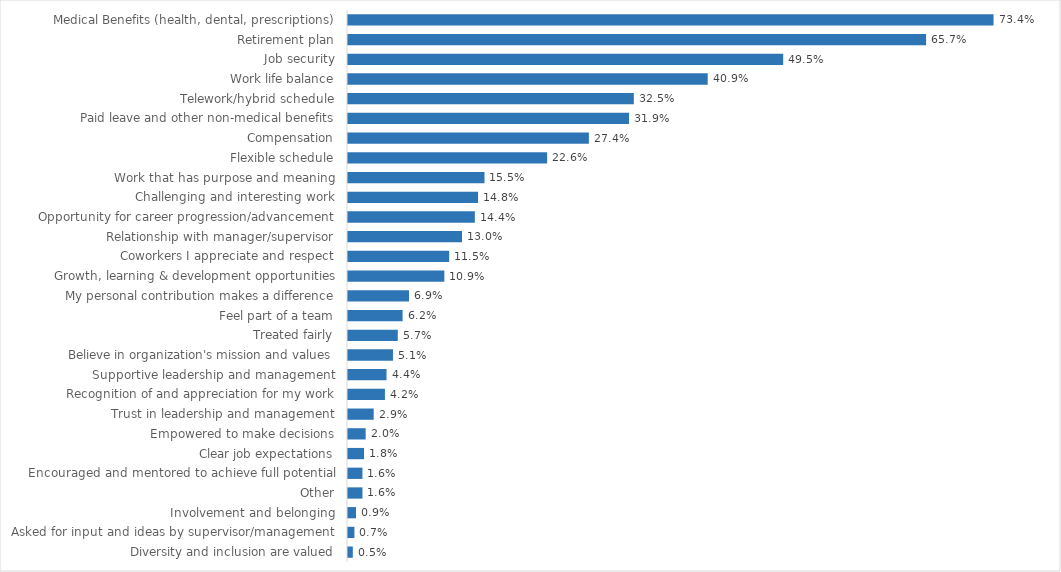
| Category | Transportation |
|---|---|
| Medical Benefits (health, dental, prescriptions) | 0.734 |
| Retirement plan | 0.657 |
| Job security | 0.495 |
| Work life balance | 0.409 |
| Telework/hybrid schedule | 0.325 |
| Paid leave and other non-medical benefits | 0.319 |
| Compensation | 0.274 |
| Flexible schedule | 0.226 |
| Work that has purpose and meaning | 0.155 |
| Challenging and interesting work | 0.148 |
| Opportunity for career progression/advancement | 0.144 |
| Relationship with manager/supervisor | 0.13 |
| Coworkers I appreciate and respect | 0.115 |
| Growth, learning & development opportunities | 0.109 |
| My personal contribution makes a difference | 0.069 |
| Feel part of a team | 0.062 |
| Treated fairly | 0.057 |
| Believe in organization's mission and values | 0.051 |
| Supportive leadership and management | 0.044 |
| Recognition of and appreciation for my work | 0.042 |
| Trust in leadership and management | 0.029 |
| Empowered to make decisions | 0.02 |
| Clear job expectations | 0.018 |
| Encouraged and mentored to achieve full potential | 0.016 |
| Other | 0.016 |
| Involvement and belonging | 0.009 |
| Asked for input and ideas by supervisor/management | 0.007 |
| Diversity and inclusion are valued | 0.005 |